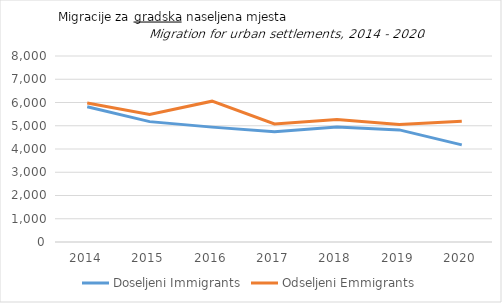
| Category | Doseljeni Immigrants | Odseljeni Emmigrants |
|---|---|---|
| 2014.0 | 5817 | 5982 |
| 2015.0 | 5177 | 5485 |
| 2016.0 | 4941 | 6057 |
| 2017.0 | 4741 | 5078 |
| 2018.0 | 4947 | 5264 |
| 2019.0 | 4822 | 5049 |
| 2020.0 | 4177 | 5194 |